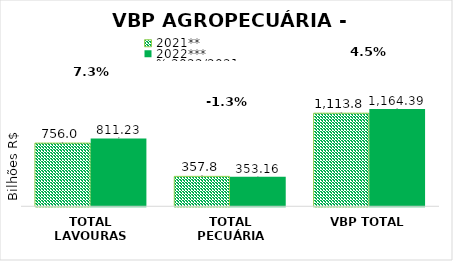
| Category | 2021** | 2022*** |
|---|---|---|
| TOTAL LAVOURAS | 756.032 | 811.233 |
| TOTAL PECUÁRIA | 357.804 | 353.162 |
| VBP TOTAL | 1113.836 | 1164.395 |